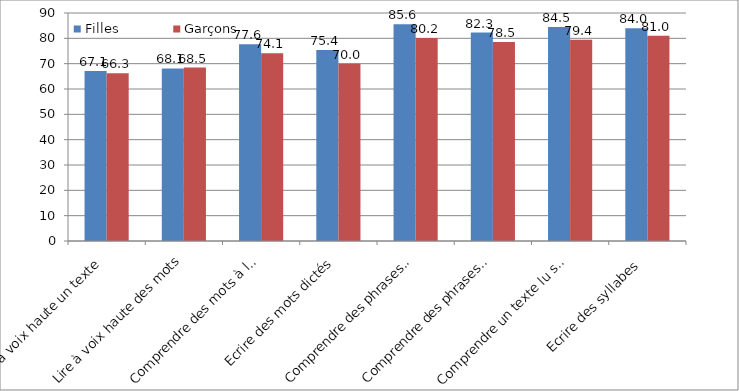
| Category | Filles  | Garçons |
|---|---|---|
| Lire à voix haute un texte | 67.09 | 66.26 |
| Lire à voix haute des mots | 68.1 | 68.46 |
| Comprendre des mots à l'oral | 77.62 | 74.08 |
| Ecrire des mots dictés | 75.35 | 69.99 |
| Comprendre des phrases à l'oral | 85.6 | 80.16 |
| Comprendre des phrases lues seul | 82.3 | 78.52 |
| Comprendre un texte lu seul | 84.46 | 79.41 |
| Ecrire des syllabes  | 83.96 | 81.03 |